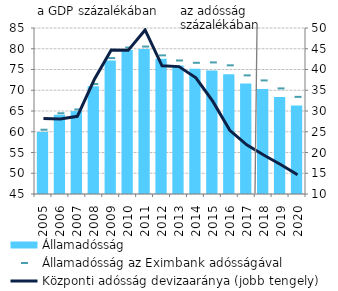
| Category | Államadósság |
|---|---|
| 2005.0 | 59.954 |
| 2006.0 | 64.091 |
| 2007.0 | 64.979 |
| 2008.0 | 70.956 |
| 2009.0 | 77.149 |
| 2010.0 | 79.727 |
| 2011.0 | 79.913 |
| 2012.0 | 77.582 |
| 2013.0 | 75.955 |
| 2014.0 | 75.156 |
| 2015.0 | 74.741 |
| 2016.0 | 73.868 |
| 2017.0 | 71.653 |
| 2018.0 | 70.291 |
| 2019.0 | 68.368 |
| 2020.0 | 66.325 |